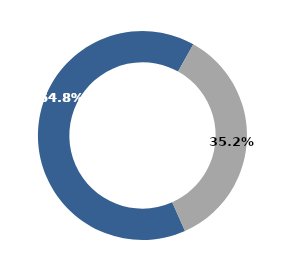
| Category | Series 1 | Series 0 | Series 2 |
|---|---|---|---|
| Promotors |  |  | 0.648 |
| Free Float |  |  | 0.352 |